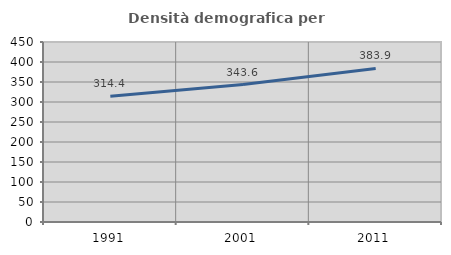
| Category | Densità demografica |
|---|---|
| 1991.0 | 314.354 |
| 2001.0 | 343.612 |
| 2011.0 | 383.916 |